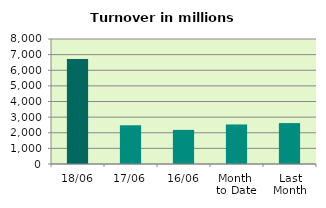
| Category | Series 0 |
|---|---|
| 18/06 | 6714.897 |
| 17/06 | 2477.878 |
| 16/06 | 2183.078 |
| Month 
to Date | 2530.046 |
| Last
Month | 2619.784 |